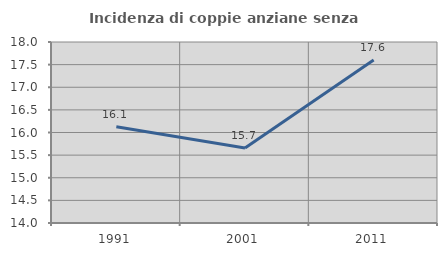
| Category | Incidenza di coppie anziane senza figli  |
|---|---|
| 1991.0 | 16.129 |
| 2001.0 | 15.659 |
| 2011.0 | 17.604 |